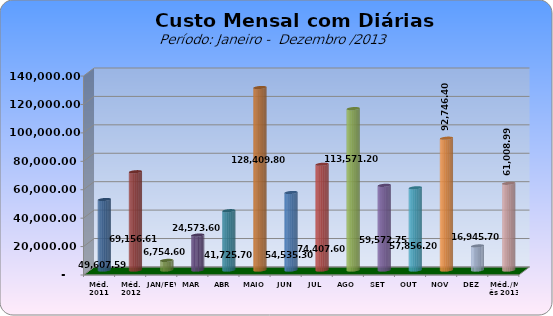
| Category | Series 0 |
|---|---|
| Méd. 2011 | 49607.59 |
| Méd. 2012 | 69156.61 |
| JAN/FEV | 6754.6 |
| MAR | 24573.6 |
| ABR | 41725.7 |
| MAIO | 128409.8 |
| JUN | 54535.3 |
| JUL | 74407.6 |
| AGO | 113571.2 |
| SET | 59572.75 |
| OUT | 57856.2 |
| NOV | 92746.4 |
| DEZ | 16945.7 |
| Méd./Mês 2013 | 61008.986 |